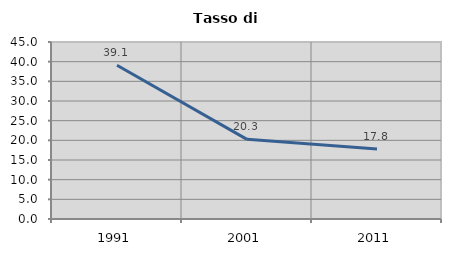
| Category | Tasso di disoccupazione   |
|---|---|
| 1991.0 | 39.078 |
| 2001.0 | 20.254 |
| 2011.0 | 17.777 |